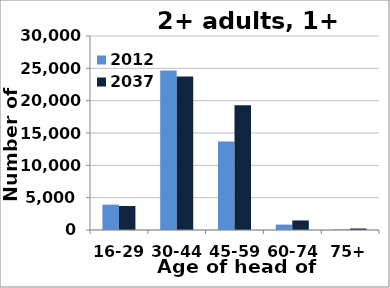
| Category | 2012 | 2037 |
|---|---|---|
| 16-29 | 3925 | 3707 |
| 30-44 | 24667 | 23733 |
| 45-59 | 13688 | 19293 |
| 60-74 | 838 | 1477 |
| 75+ | 90 | 234 |